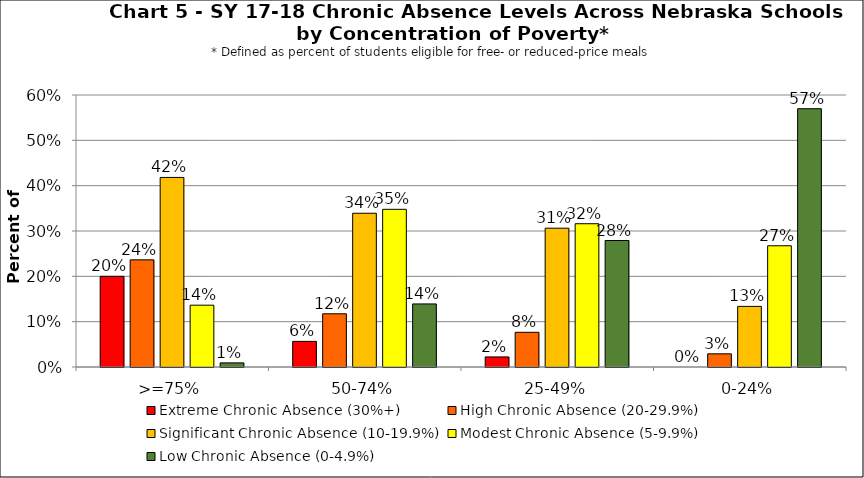
| Category | Extreme Chronic Absence (30%+) | High Chronic Absence (20-29.9%) | Significant Chronic Absence (10-19.9%) | Modest Chronic Absence (5-9.9%) | Low Chronic Absence (0-4.9%) |
|---|---|---|---|---|---|
| 0 | 0.2 | 0.236 | 0.418 | 0.136 | 0.009 |
| 1 | 0.057 | 0.117 | 0.339 | 0.348 | 0.139 |
| 2 | 0.022 | 0.077 | 0.306 | 0.316 | 0.279 |
| 3 | 0 | 0.029 | 0.134 | 0.267 | 0.57 |